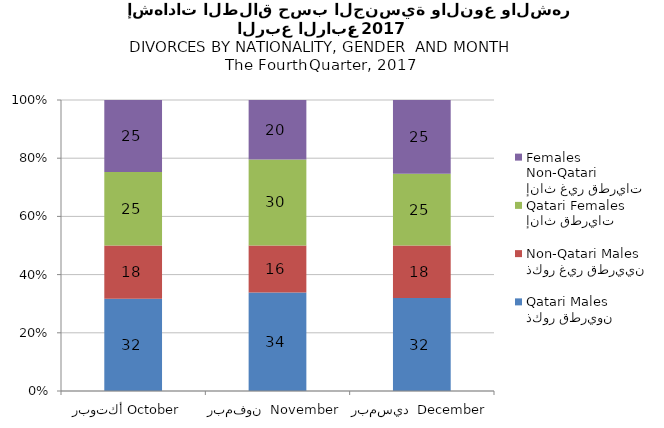
| Category | ذكور قطريون
Qatari Males | ذكور غير قطريين
Non-Qatari Males | إناث قطريات
Qatari Females | إناث غير قطريات
Non-Qatari Females |
|---|---|---|---|---|
| أكتوبر October   | 31.739 | 18.261 | 25.217 | 24.783 |
| نوفمبر  November | 33.871 | 16.129 | 29.57 | 20.43 |
| ديسمبر  December   | 31.928 | 18.072 | 24.699 | 25.301 |